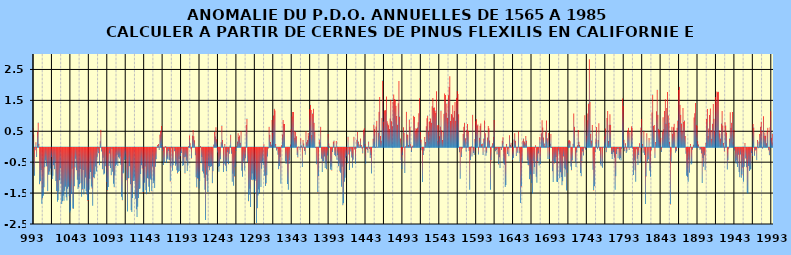
| Category | PDO |
|---|---|
| 993.0 | 0.611 |
| 994.0 | 0.399 |
| 995.0 | -0.904 |
| 996.0 | -0.085 |
| 997.0 | 0.143 |
| 998.0 | -0.303 |
| 999.0 | 0.488 |
| 1000.0 | 0.783 |
| 1001.0 | 0.096 |
| 1002.0 | -1.183 |
| 1003.0 | -1.089 |
| 1004.0 | -0.722 |
| 1005.0 | -1.811 |
| 1006.0 | -1.636 |
| 1007.0 | -1.558 |
| 1008.0 | -1.278 |
| 1009.0 | -0.634 |
| 1010.0 | -0.421 |
| 1011.0 | -0.595 |
| 1012.0 | -0.615 |
| 1013.0 | -1.404 |
| 1014.0 | -0.876 |
| 1015.0 | -0.767 |
| 1016.0 | -0.874 |
| 1017.0 | -0.673 |
| 1018.0 | -0.298 |
| 1019.0 | -1.015 |
| 1020.0 | -0.909 |
| 1021.0 | -0.565 |
| 1022.0 | -0.698 |
| 1023.0 | -0.473 |
| 1024.0 | -1.076 |
| 1025.0 | -1.407 |
| 1026.0 | -1.744 |
| 1027.0 | -1.692 |
| 1028.0 | -1.418 |
| 1029.0 | -1.055 |
| 1030.0 | -0.66 |
| 1031.0 | -1.165 |
| 1032.0 | -1.823 |
| 1033.0 | -1.731 |
| 1034.0 | -1.554 |
| 1035.0 | -1.716 |
| 1036.0 | -1.389 |
| 1037.0 | -1.262 |
| 1038.0 | -1.604 |
| 1039.0 | -1.711 |
| 1040.0 | -1.331 |
| 1041.0 | -1.259 |
| 1042.0 | -1.573 |
| 1043.0 | -2.099 |
| 1044.0 | -2.033 |
| 1045.0 | -1.489 |
| 1046.0 | -0.681 |
| 1047.0 | -1.965 |
| 1048.0 | -1.972 |
| 1049.0 | -1.246 |
| 1050.0 | -0.638 |
| 1051.0 | -0.354 |
| 1052.0 | -0.732 |
| 1053.0 | -1.035 |
| 1054.0 | -1.338 |
| 1055.0 | -1.276 |
| 1056.0 | -1.183 |
| 1057.0 | -0.689 |
| 1058.0 | -1.151 |
| 1059.0 | -1.589 |
| 1060.0 | -1.348 |
| 1061.0 | -0.721 |
| 1062.0 | -1.513 |
| 1063.0 | -1.329 |
| 1064.0 | -0.964 |
| 1065.0 | -1.408 |
| 1066.0 | -1.512 |
| 1067.0 | -1.706 |
| 1068.0 | -1.704 |
| 1069.0 | -1.356 |
| 1070.0 | -1.006 |
| 1071.0 | -0.784 |
| 1072.0 | -1.258 |
| 1073.0 | -1.318 |
| 1074.0 | -1.878 |
| 1075.0 | -0.954 |
| 1076.0 | -0.985 |
| 1077.0 | -0.86 |
| 1078.0 | -0.61 |
| 1079.0 | -0.769 |
| 1080.0 | -0.32 |
| 1081.0 | -0.068 |
| 1082.0 | -0.18 |
| 1083.0 | -0.569 |
| 1084.0 | 0.177 |
| 1085.0 | 0.547 |
| 1086.0 | -0.126 |
| 1087.0 | -0.696 |
| 1088.0 | -0.323 |
| 1089.0 | -0.868 |
| 1090.0 | -0.837 |
| 1091.0 | -0.6 |
| 1092.0 | -0.016 |
| 1093.0 | -1.122 |
| 1094.0 | -1.381 |
| 1095.0 | -1.273 |
| 1096.0 | -0.59 |
| 1097.0 | -0.183 |
| 1098.0 | -0.655 |
| 1099.0 | -0.892 |
| 1100.0 | -0.043 |
| 1101.0 | -0.778 |
| 1102.0 | -1.166 |
| 1103.0 | -1.277 |
| 1104.0 | -0.9 |
| 1105.0 | -0.595 |
| 1106.0 | -0.555 |
| 1107.0 | -0.229 |
| 1108.0 | -0.593 |
| 1109.0 | -0.304 |
| 1110.0 | -0.349 |
| 1111.0 | -0.281 |
| 1112.0 | -0.555 |
| 1113.0 | -1.584 |
| 1114.0 | -1.696 |
| 1115.0 | -0.834 |
| 1116.0 | -0.811 |
| 1117.0 | -0.4 |
| 1118.0 | -0.19 |
| 1119.0 | -0.38 |
| 1120.0 | -1.053 |
| 1121.0 | -2.064 |
| 1122.0 | -0.995 |
| 1123.0 | -0.979 |
| 1124.0 | -0.598 |
| 1125.0 | -1.184 |
| 1126.0 | -2.022 |
| 1127.0 | -2.076 |
| 1128.0 | -1.626 |
| 1129.0 | -1.079 |
| 1130.0 | -0.975 |
| 1131.0 | -1.083 |
| 1132.0 | -1.647 |
| 1133.0 | -1.99 |
| 1134.0 | -2.243 |
| 1135.0 | -1.906 |
| 1136.0 | -1.627 |
| 1137.0 | -1.333 |
| 1138.0 | -1.318 |
| 1139.0 | -0.848 |
| 1140.0 | -0.563 |
| 1141.0 | -0.671 |
| 1142.0 | -1.447 |
| 1143.0 | -1.439 |
| 1144.0 | -1.133 |
| 1145.0 | -0.604 |
| 1146.0 | -1.373 |
| 1147.0 | -1.509 |
| 1148.0 | -0.983 |
| 1149.0 | -1.003 |
| 1150.0 | -1.263 |
| 1151.0 | -1.421 |
| 1152.0 | -1.001 |
| 1153.0 | -1.048 |
| 1154.0 | -1.412 |
| 1155.0 | -0.611 |
| 1156.0 | -1.145 |
| 1157.0 | -1.066 |
| 1158.0 | -1.3 |
| 1159.0 | -0.616 |
| 1160.0 | -0.376 |
| 1161.0 | -0.009 |
| 1162.0 | 0.054 |
| 1163.0 | 0.089 |
| 1164.0 | -0.072 |
| 1165.0 | 0.394 |
| 1166.0 | 0.518 |
| 1167.0 | 0.671 |
| 1168.0 | 0.07 |
| 1169.0 | -0.115 |
| 1170.0 | -0.562 |
| 1171.0 | -0.473 |
| 1172.0 | 0.007 |
| 1173.0 | 0.024 |
| 1174.0 | -0.497 |
| 1175.0 | -0.355 |
| 1176.0 | -0.389 |
| 1177.0 | -0.107 |
| 1178.0 | -0.408 |
| 1179.0 | -1.092 |
| 1180.0 | -0.598 |
| 1181.0 | -0.016 |
| 1182.0 | -0.748 |
| 1183.0 | -0.568 |
| 1184.0 | -0.001 |
| 1185.0 | -0.112 |
| 1186.0 | -0.586 |
| 1187.0 | -0.535 |
| 1188.0 | -0.727 |
| 1189.0 | -0.833 |
| 1190.0 | -0.777 |
| 1191.0 | -0.361 |
| 1192.0 | -0.751 |
| 1193.0 | -0.274 |
| 1194.0 | -0.167 |
| 1195.0 | -0.021 |
| 1196.0 | -0.588 |
| 1197.0 | -0.556 |
| 1198.0 | -0.306 |
| 1199.0 | -0.83 |
| 1200.0 | -0.294 |
| 1201.0 | -0.418 |
| 1202.0 | -0.755 |
| 1203.0 | -0.579 |
| 1204.0 | 0.025 |
| 1205.0 | 0.364 |
| 1206.0 | 0.116 |
| 1207.0 | -0.049 |
| 1208.0 | -0.347 |
| 1209.0 | 0.362 |
| 1210.0 | 0.541 |
| 1211.0 | 0.34 |
| 1212.0 | 0.207 |
| 1213.0 | -0.242 |
| 1214.0 | -0.953 |
| 1215.0 | -1.283 |
| 1216.0 | -0.995 |
| 1217.0 | -0.999 |
| 1218.0 | -1.321 |
| 1219.0 | -1.076 |
| 1220.0 | 0.02 |
| 1221.0 | -0.503 |
| 1222.0 | -0.297 |
| 1223.0 | -0.769 |
| 1224.0 | -0.835 |
| 1225.0 | -0.971 |
| 1226.0 | -1.356 |
| 1227.0 | -2.342 |
| 1228.0 | -0.876 |
| 1229.0 | -1.08 |
| 1230.0 | -1.437 |
| 1231.0 | -0.601 |
| 1232.0 | -0.727 |
| 1233.0 | -0.607 |
| 1234.0 | -0.626 |
| 1235.0 | -0.593 |
| 1236.0 | -1.149 |
| 1237.0 | -0.76 |
| 1238.0 | 0.069 |
| 1239.0 | 0.483 |
| 1240.0 | 0.331 |
| 1241.0 | 0.627 |
| 1242.0 | 0.239 |
| 1243.0 | -0.158 |
| 1244.0 | -0.624 |
| 1245.0 | -0.779 |
| 1246.0 | -0.595 |
| 1247.0 | -0.376 |
| 1248.0 | 0.145 |
| 1249.0 | 0.686 |
| 1250.0 | 0.218 |
| 1251.0 | -0.786 |
| 1252.0 | -0.542 |
| 1253.0 | 0.088 |
| 1254.0 | -0.586 |
| 1255.0 | -0.751 |
| 1256.0 | -0.47 |
| 1257.0 | -0.148 |
| 1258.0 | -0.536 |
| 1259.0 | -0.197 |
| 1260.0 | 0.038 |
| 1261.0 | 0.394 |
| 1262.0 | -0.192 |
| 1263.0 | -1.1 |
| 1264.0 | -0.843 |
| 1265.0 | -1.227 |
| 1266.0 | -0.929 |
| 1267.0 | -0.629 |
| 1268.0 | -0.11 |
| 1269.0 | 0.019 |
| 1270.0 | 0.168 |
| 1271.0 | 0.433 |
| 1272.0 | 0.314 |
| 1273.0 | 0.365 |
| 1274.0 | 0.129 |
| 1275.0 | 0.498 |
| 1276.0 | -0.746 |
| 1277.0 | -0.935 |
| 1278.0 | -0.454 |
| 1279.0 | -0.407 |
| 1280.0 | -0.741 |
| 1281.0 | -0.341 |
| 1282.0 | 0.702 |
| 1283.0 | 0.913 |
| 1284.0 | -0.463 |
| 1285.0 | -1.732 |
| 1286.0 | -1.518 |
| 1287.0 | -1.326 |
| 1288.0 | -1.915 |
| 1289.0 | -1.036 |
| 1290.0 | -0.835 |
| 1291.0 | -1.054 |
| 1292.0 | -1.03 |
| 1293.0 | -1.466 |
| 1294.0 | -1.014 |
| 1295.0 | -1.07 |
| 1296.0 | -2.443 |
| 1297.0 | -1.961 |
| 1298.0 | -1.548 |
| 1299.0 | -1.355 |
| 1300.0 | -1.471 |
| 1301.0 | -0.496 |
| 1302.0 | -1.27 |
| 1303.0 | -0.684 |
| 1304.0 | -0.454 |
| 1305.0 | -0.565 |
| 1306.0 | 0.082 |
| 1307.0 | -0.904 |
| 1308.0 | -1.235 |
| 1309.0 | -1.154 |
| 1310.0 | -0.886 |
| 1311.0 | -0.286 |
| 1312.0 | -0.022 |
| 1313.0 | 0.649 |
| 1314.0 | 0.389 |
| 1315.0 | 0.154 |
| 1316.0 | 0.067 |
| 1317.0 | 0.862 |
| 1318.0 | 0.448 |
| 1319.0 | 1.014 |
| 1320.0 | 1.226 |
| 1321.0 | 1.173 |
| 1322.0 | 0.091 |
| 1323.0 | -0.093 |
| 1324.0 | -0.03 |
| 1325.0 | -0.225 |
| 1326.0 | -0.697 |
| 1327.0 | -0.593 |
| 1328.0 | -0.301 |
| 1329.0 | -1.164 |
| 1330.0 | 0.049 |
| 1331.0 | 0.399 |
| 1332.0 | 0.864 |
| 1333.0 | 0.738 |
| 1334.0 | 0.736 |
| 1335.0 | -0.431 |
| 1336.0 | -0.526 |
| 1337.0 | -0.453 |
| 1338.0 | -1.174 |
| 1339.0 | -1.361 |
| 1340.0 | -0.529 |
| 1341.0 | -0.411 |
| 1342.0 | 0.075 |
| 1343.0 | 0.584 |
| 1344.0 | 0.981 |
| 1345.0 | 1.125 |
| 1346.0 | 1.122 |
| 1347.0 | 0.514 |
| 1348.0 | 0.291 |
| 1349.0 | 0.482 |
| 1350.0 | 0.338 |
| 1351.0 | -0.234 |
| 1352.0 | -0.316 |
| 1353.0 | 0.011 |
| 1354.0 | -0.001 |
| 1355.0 | -0.07 |
| 1356.0 | 0.272 |
| 1357.0 | 0.038 |
| 1358.0 | -0.623 |
| 1359.0 | 0.216 |
| 1360.0 | 0.107 |
| 1361.0 | -0.109 |
| 1362.0 | -0.227 |
| 1363.0 | 0.499 |
| 1364.0 | 0.147 |
| 1365.0 | 0.216 |
| 1366.0 | 0.441 |
| 1367.0 | 0.343 |
| 1368.0 | 1.211 |
| 1369.0 | 1.36 |
| 1370.0 | 1.189 |
| 1371.0 | 0.381 |
| 1372.0 | 1.074 |
| 1373.0 | 1.232 |
| 1374.0 | 0.776 |
| 1375.0 | 0.486 |
| 1376.0 | -0.005 |
| 1377.0 | -0.531 |
| 1378.0 | -0.009 |
| 1379.0 | -1.447 |
| 1380.0 | -0.924 |
| 1381.0 | 0.232 |
| 1382.0 | 0.147 |
| 1383.0 | 0.644 |
| 1384.0 | -0.355 |
| 1385.0 | -0.787 |
| 1386.0 | -0.429 |
| 1387.0 | -0.45 |
| 1388.0 | -0.287 |
| 1389.0 | -0.653 |
| 1390.0 | -0.513 |
| 1391.0 | -0.695 |
| 1392.0 | -0.254 |
| 1393.0 | 0.423 |
| 1394.0 | 0.106 |
| 1395.0 | 0.012 |
| 1396.0 | -0.708 |
| 1397.0 | -0.619 |
| 1398.0 | -0.737 |
| 1399.0 | -0.139 |
| 1400.0 | 0.16 |
| 1401.0 | 0.199 |
| 1402.0 | -0.232 |
| 1403.0 | -0.277 |
| 1404.0 | 0.184 |
| 1405.0 | -0.392 |
| 1406.0 | -0.235 |
| 1407.0 | -0.601 |
| 1408.0 | -0.502 |
| 1409.0 | -0.767 |
| 1410.0 | -0.813 |
| 1411.0 | -1.259 |
| 1412.0 | -0.617 |
| 1413.0 | -1.858 |
| 1414.0 | -1.797 |
| 1415.0 | -1.105 |
| 1416.0 | -0.97 |
| 1417.0 | -0.326 |
| 1418.0 | -0.276 |
| 1419.0 | -0.507 |
| 1420.0 | 0.329 |
| 1421.0 | -0.218 |
| 1422.0 | -0.721 |
| 1423.0 | -0.125 |
| 1424.0 | -0.023 |
| 1425.0 | -0.318 |
| 1426.0 | -0.651 |
| 1427.0 | -0.386 |
| 1428.0 | 0.325 |
| 1429.0 | -0.056 |
| 1430.0 | -0.522 |
| 1431.0 | -0.03 |
| 1432.0 | 0.229 |
| 1433.0 | 0.484 |
| 1434.0 | 0.167 |
| 1435.0 | -0.011 |
| 1436.0 | 0.074 |
| 1437.0 | 0.268 |
| 1438.0 | 0.052 |
| 1439.0 | -0.032 |
| 1440.0 | -0.183 |
| 1441.0 | 0.551 |
| 1442.0 | 0.599 |
| 1443.0 | 0.097 |
| 1444.0 | -0.521 |
| 1445.0 | -0.043 |
| 1446.0 | -0.073 |
| 1447.0 | -0.163 |
| 1448.0 | 0.166 |
| 1449.0 | -0.04 |
| 1450.0 | -0.335 |
| 1451.0 | -0.238 |
| 1452.0 | -0.836 |
| 1453.0 | 0.007 |
| 1454.0 | 0.262 |
| 1455.0 | 0.719 |
| 1456.0 | 0.58 |
| 1457.0 | -0.012 |
| 1458.0 | 0.655 |
| 1459.0 | 0.843 |
| 1460.0 | -0.003 |
| 1461.0 | 0.457 |
| 1462.0 | 1.129 |
| 1463.0 | 1.605 |
| 1464.0 | 0.345 |
| 1465.0 | 0.19 |
| 1466.0 | 0.929 |
| 1467.0 | 2.14 |
| 1468.0 | 0.814 |
| 1469.0 | 1.153 |
| 1470.0 | 1.186 |
| 1471.0 | 1.181 |
| 1472.0 | 1.626 |
| 1473.0 | 0.827 |
| 1474.0 | 0.755 |
| 1475.0 | 0.693 |
| 1476.0 | 0.573 |
| 1477.0 | 0.914 |
| 1478.0 | 1.52 |
| 1479.0 | 0.825 |
| 1480.0 | 0.662 |
| 1481.0 | 1.45 |
| 1482.0 | 1.693 |
| 1483.0 | 1.546 |
| 1484.0 | 1.519 |
| 1485.0 | 1.328 |
| 1486.0 | 0.991 |
| 1487.0 | 0.711 |
| 1488.0 | 1.405 |
| 1489.0 | 2.124 |
| 1490.0 | 0.976 |
| 1491.0 | 0.267 |
| 1492.0 | -0.394 |
| 1493.0 | -0.688 |
| 1494.0 | -0.246 |
| 1495.0 | 0.628 |
| 1496.0 | 0.456 |
| 1497.0 | -0.815 |
| 1498.0 | 0.018 |
| 1499.0 | 1.131 |
| 1500.0 | 0.404 |
| 1501.0 | 0.381 |
| 1502.0 | 0.06 |
| 1503.0 | 0.88 |
| 1504.0 | 0.649 |
| 1505.0 | 0.081 |
| 1506.0 | -0.139 |
| 1507.0 | 0.025 |
| 1508.0 | 0.041 |
| 1509.0 | 1 |
| 1510.0 | 0.958 |
| 1511.0 | 0.511 |
| 1512.0 | 0.599 |
| 1513.0 | 0.585 |
| 1514.0 | 0.621 |
| 1515.0 | 0.79 |
| 1516.0 | 1.081 |
| 1517.0 | 1.571 |
| 1518.0 | 0.485 |
| 1519.0 | 0.231 |
| 1520.0 | -0.083 |
| 1521.0 | -1.113 |
| 1522.0 | -0.232 |
| 1523.0 | -0.101 |
| 1524.0 | 0.312 |
| 1525.0 | 0.155 |
| 1526.0 | 0.664 |
| 1527.0 | 0.923 |
| 1528.0 | 1.006 |
| 1529.0 | 0.483 |
| 1530.0 | 0.801 |
| 1531.0 | 0.83 |
| 1532.0 | 0.916 |
| 1533.0 | 0.775 |
| 1534.0 | 1.308 |
| 1535.0 | 1.575 |
| 1536.0 | 1.265 |
| 1537.0 | 1.272 |
| 1538.0 | 1.17 |
| 1539.0 | 1.094 |
| 1540.0 | 1.798 |
| 1541.0 | 0.699 |
| 1542.0 | 0.186 |
| 1543.0 | 0.706 |
| 1544.0 | 0.34 |
| 1545.0 | 0.653 |
| 1546.0 | 1.169 |
| 1547.0 | 0.53 |
| 1548.0 | 0.215 |
| 1549.0 | 0.492 |
| 1550.0 | 1.07 |
| 1551.0 | 1.724 |
| 1552.0 | 1.676 |
| 1553.0 | 1.102 |
| 1554.0 | 1.397 |
| 1555.0 | 0.934 |
| 1556.0 | 1.662 |
| 1557.0 | 1.931 |
| 1558.0 | 2.28 |
| 1559.0 | 0.835 |
| 1560.0 | 1.057 |
| 1561.0 | 1.022 |
| 1562.0 | 1.345 |
| 1563.0 | 0.949 |
| 1564.0 | 1.156 |
| 1565.0 | 1.444 |
| 1566.0 | 0.838 |
| 1567.0 | 1.581 |
| 1568.0 | 1.816 |
| 1569.0 | 1.708 |
| 1570.0 | 1.049 |
| 1571.0 | -0.148 |
| 1572.0 | -1.008 |
| 1573.0 | -0.007 |
| 1574.0 | -0.303 |
| 1575.0 | -0.023 |
| 1576.0 | 0.412 |
| 1577.0 | 0.647 |
| 1578.0 | 0.775 |
| 1579.0 | 0.276 |
| 1580.0 | -0.122 |
| 1581.0 | 0.549 |
| 1582.0 | 0.735 |
| 1583.0 | 0.515 |
| 1584.0 | -0.107 |
| 1585.0 | -1.361 |
| 1586.0 | -0.398 |
| 1587.0 | 0.017 |
| 1588.0 | -0.288 |
| 1589.0 | 1.031 |
| 1590.0 | -0.167 |
| 1591.0 | -0.238 |
| 1592.0 | 0.25 |
| 1593.0 | 0.826 |
| 1594.0 | 0.888 |
| 1595.0 | 0.685 |
| 1596.0 | 0.722 |
| 1597.0 | -0.222 |
| 1598.0 | 0.29 |
| 1599.0 | 0.682 |
| 1600.0 | 0.752 |
| 1601.0 | 0.083 |
| 1602.0 | 0.101 |
| 1603.0 | -0.235 |
| 1604.0 | 0.263 |
| 1605.0 | 0.85 |
| 1606.0 | 0.437 |
| 1607.0 | -0.259 |
| 1608.0 | -0.166 |
| 1609.0 | 0.302 |
| 1610.0 | 0.674 |
| 1611.0 | 0.599 |
| 1612.0 | 0.205 |
| 1613.0 | -1.363 |
| 1614.0 | -0.412 |
| 1615.0 | 0.032 |
| 1616.0 | 0.112 |
| 1617.0 | 0.323 |
| 1618.0 | 0.869 |
| 1619.0 | -0.014 |
| 1620.0 | -0.113 |
| 1621.0 | -0.074 |
| 1622.0 | -0.217 |
| 1623.0 | -0.03 |
| 1624.0 | -0.539 |
| 1625.0 | -0.31 |
| 1626.0 | -0.657 |
| 1627.0 | -0.009 |
| 1628.0 | -0.071 |
| 1629.0 | 0.196 |
| 1630.0 | 0.306 |
| 1631.0 | -0.501 |
| 1632.0 | -0.555 |
| 1633.0 | -1.275 |
| 1634.0 | -1.207 |
| 1635.0 | 0.092 |
| 1636.0 | -0.203 |
| 1637.0 | -0.024 |
| 1638.0 | -0.278 |
| 1639.0 | 0.375 |
| 1640.0 | 0.062 |
| 1641.0 | 0.13 |
| 1642.0 | 0.01 |
| 1643.0 | -0.402 |
| 1644.0 | -0.331 |
| 1645.0 | 0.231 |
| 1646.0 | 0.435 |
| 1647.0 | 0.192 |
| 1648.0 | -0.27 |
| 1649.0 | -0.006 |
| 1650.0 | -0.161 |
| 1651.0 | 0.496 |
| 1652.0 | -0.177 |
| 1653.0 | -0.454 |
| 1654.0 | -1.786 |
| 1655.0 | -1.252 |
| 1656.0 | -0.479 |
| 1657.0 | 0.195 |
| 1658.0 | 0.265 |
| 1659.0 | 0.171 |
| 1660.0 | 0.109 |
| 1661.0 | 0.345 |
| 1662.0 | 0.199 |
| 1663.0 | -0.403 |
| 1664.0 | -0.553 |
| 1665.0 | -0.573 |
| 1666.0 | -1.018 |
| 1667.0 | -0.854 |
| 1668.0 | -0.902 |
| 1669.0 | -1.14 |
| 1670.0 | -1.484 |
| 1671.0 | -0.435 |
| 1672.0 | -0.846 |
| 1673.0 | -0.625 |
| 1674.0 | 0.045 |
| 1675.0 | -0.942 |
| 1676.0 | -1.13 |
| 1677.0 | -0.445 |
| 1678.0 | -0.184 |
| 1679.0 | -0.577 |
| 1680.0 | 0.313 |
| 1681.0 | -0.537 |
| 1682.0 | 0.435 |
| 1683.0 | 0.86 |
| 1684.0 | 0.622 |
| 1685.0 | 0.302 |
| 1686.0 | 0.103 |
| 1687.0 | 0.025 |
| 1688.0 | 0.475 |
| 1689.0 | 0.85 |
| 1690.0 | 0.278 |
| 1691.0 | -0.362 |
| 1692.0 | 0.446 |
| 1693.0 | -0.376 |
| 1694.0 | 0.093 |
| 1695.0 | 0.411 |
| 1696.0 | -0.009 |
| 1697.0 | -0.762 |
| 1698.0 | -1.11 |
| 1699.0 | -0.443 |
| 1700.0 | -0.508 |
| 1701.0 | -0.459 |
| 1702.0 | -0.3 |
| 1703.0 | -1.099 |
| 1704.0 | -1.111 |
| 1705.0 | -0.093 |
| 1706.0 | -0.208 |
| 1707.0 | -0.991 |
| 1708.0 | -0.791 |
| 1709.0 | -0.947 |
| 1710.0 | -1.215 |
| 1711.0 | -1.085 |
| 1712.0 | -0.283 |
| 1713.0 | -0.666 |
| 1714.0 | -0.941 |
| 1715.0 | -0.707 |
| 1716.0 | -1.385 |
| 1717.0 | -0.807 |
| 1718.0 | -0.012 |
| 1719.0 | 0.205 |
| 1720.0 | 0.206 |
| 1721.0 | 0.18 |
| 1722.0 | -0.611 |
| 1723.0 | -0.732 |
| 1724.0 | -0.412 |
| 1725.0 | 0.097 |
| 1726.0 | 1.077 |
| 1727.0 | 0.65 |
| 1728.0 | -0.467 |
| 1729.0 | -0.622 |
| 1730.0 | -0.156 |
| 1731.0 | 0.05 |
| 1732.0 | 0.543 |
| 1733.0 | 0.159 |
| 1734.0 | 0.052 |
| 1735.0 | -0.821 |
| 1736.0 | -0.923 |
| 1737.0 | -0.443 |
| 1738.0 | -0.121 |
| 1739.0 | -0.254 |
| 1740.0 | -0.021 |
| 1741.0 | 1.019 |
| 1742.0 | -0.062 |
| 1743.0 | 0.355 |
| 1744.0 | 0.854 |
| 1745.0 | 1.078 |
| 1746.0 | 1.395 |
| 1747.0 | 2.832 |
| 1748.0 | 1.46 |
| 1749.0 | 0.424 |
| 1750.0 | 0.199 |
| 1751.0 | 0.7 |
| 1752.0 | -0.713 |
| 1753.0 | -1.382 |
| 1754.0 | -1.249 |
| 1755.0 | -0.143 |
| 1756.0 | 0.235 |
| 1757.0 | 0.642 |
| 1758.0 | -0.051 |
| 1759.0 | 0.217 |
| 1760.0 | 0.762 |
| 1761.0 | -0.099 |
| 1762.0 | -0.54 |
| 1763.0 | -0.601 |
| 1764.0 | -0.006 |
| 1765.0 | -0.648 |
| 1766.0 | -0.005 |
| 1767.0 | 0.004 |
| 1768.0 | 0.335 |
| 1769.0 | 0.591 |
| 1770.0 | -0.147 |
| 1771.0 | 0.927 |
| 1772.0 | 1.159 |
| 1773.0 | 0.186 |
| 1774.0 | 0.71 |
| 1775.0 | 1.054 |
| 1776.0 | 0.713 |
| 1777.0 | -0.2 |
| 1778.0 | -0.368 |
| 1779.0 | -0.203 |
| 1780.0 | -0.148 |
| 1781.0 | -0.32 |
| 1782.0 | -1.36 |
| 1783.0 | -0.926 |
| 1784.0 | -0.204 |
| 1785.0 | -0.042 |
| 1786.0 | -0.339 |
| 1787.0 | -0.04 |
| 1788.0 | -0.382 |
| 1789.0 | -0.329 |
| 1790.0 | -0.414 |
| 1791.0 | -0.044 |
| 1792.0 | 1.563 |
| 1793.0 | 1.325 |
| 1794.0 | 0.228 |
| 1795.0 | -0.117 |
| 1796.0 | 0.114 |
| 1797.0 | -0.171 |
| 1798.0 | -0.124 |
| 1799.0 | 0.527 |
| 1800.0 | 0.612 |
| 1801.0 | -0.073 |
| 1802.0 | 0.469 |
| 1803.0 | 0.007 |
| 1804.0 | 0.665 |
| 1805.0 | 0.605 |
| 1806.0 | -0.045 |
| 1807.0 | -0.882 |
| 1808.0 | -0.415 |
| 1809.0 | -0.726 |
| 1810.0 | -1.103 |
| 1811.0 | -0.052 |
| 1812.0 | -0.355 |
| 1813.0 | -0.557 |
| 1814.0 | -0.236 |
| 1815.0 | 0.116 |
| 1816.0 | -0.48 |
| 1817.0 | 0.622 |
| 1818.0 | 0.9 |
| 1819.0 | 0.09 |
| 1820.0 | -0.163 |
| 1821.0 | 0.523 |
| 1822.0 | -0.237 |
| 1823.0 | -1.818 |
| 1824.0 | -0.931 |
| 1825.0 | 0.437 |
| 1826.0 | -0.449 |
| 1827.0 | -0.379 |
| 1828.0 | 0.279 |
| 1829.0 | -0.741 |
| 1830.0 | -0.935 |
| 1831.0 | -0.087 |
| 1832.0 | 1.108 |
| 1833.0 | 1.689 |
| 1834.0 | 0.668 |
| 1835.0 | 0.703 |
| 1836.0 | -0.331 |
| 1837.0 | 0.155 |
| 1838.0 | 1.147 |
| 1839.0 | 1.844 |
| 1840.0 | 1.032 |
| 1841.0 | 0.583 |
| 1842.0 | 0.535 |
| 1843.0 | 0.208 |
| 1844.0 | 0.292 |
| 1845.0 | -0.139 |
| 1846.0 | 0.479 |
| 1847.0 | 0.952 |
| 1848.0 | 0.564 |
| 1849.0 | 1.152 |
| 1850.0 | 1.54 |
| 1851.0 | 0.748 |
| 1852.0 | 1.252 |
| 1853.0 | 1.774 |
| 1854.0 | 1.012 |
| 1855.0 | 0.769 |
| 1856.0 | 0.165 |
| 1857.0 | -1.835 |
| 1858.0 | -0.445 |
| 1859.0 | 0.643 |
| 1860.0 | 0.42 |
| 1861.0 | 0.632 |
| 1862.0 | 0.742 |
| 1863.0 | 0.472 |
| 1864.0 | -0.162 |
| 1865.0 | -0.114 |
| 1866.0 | 0.616 |
| 1867.0 | 0.848 |
| 1868.0 | 1.836 |
| 1869.0 | 1.94 |
| 1870.0 | 1.356 |
| 1871.0 | 1.033 |
| 1872.0 | 0.751 |
| 1873.0 | 0.508 |
| 1874.0 | 1.252 |
| 1875.0 | 0.798 |
| 1876.0 | 0.847 |
| 1877.0 | 0.345 |
| 1878.0 | -0.192 |
| 1879.0 | -0.903 |
| 1880.0 | -0.952 |
| 1881.0 | -1.098 |
| 1882.0 | -0.389 |
| 1883.0 | -0.812 |
| 1884.0 | 0.085 |
| 1885.0 | -0.543 |
| 1886.0 | -0.51 |
| 1887.0 | -0.067 |
| 1888.0 | 0.063 |
| 1889.0 | 0.948 |
| 1890.0 | 1.079 |
| 1891.0 | 1.416 |
| 1892.0 | 0.712 |
| 1893.0 | 0.673 |
| 1894.0 | 0.175 |
| 1895.0 | 0.073 |
| 1896.0 | 0 |
| 1897.0 | -0.068 |
| 1898.0 | -0.052 |
| 1899.0 | -0.184 |
| 1900.0 | -1.143 |
| 1901.0 | -0.331 |
| 1902.0 | -0.614 |
| 1903.0 | -0.243 |
| 1904.0 | -0.728 |
| 1905.0 | 0.125 |
| 1906.0 | 0.9 |
| 1907.0 | 1.217 |
| 1908.0 | 0.343 |
| 1909.0 | 0.593 |
| 1910.0 | 1.024 |
| 1911.0 | 1.24 |
| 1912.0 | 0.54 |
| 1913.0 | 0.261 |
| 1914.0 | 0.742 |
| 1915.0 | 1.384 |
| 1916.0 | 0.904 |
| 1917.0 | 0.501 |
| 1918.0 | 1.612 |
| 1919.0 | 1.462 |
| 1920.0 | 1.79 |
| 1921.0 | 1.76 |
| 1922.0 | 1.781 |
| 1923.0 | 0.535 |
| 1924.0 | 0.431 |
| 1925.0 | 0.265 |
| 1926.0 | 0.75 |
| 1927.0 | 1.158 |
| 1928.0 | 0.69 |
| 1929.0 | 0.121 |
| 1930.0 | -0.12 |
| 1931.0 | 0.795 |
| 1932.0 | 0.683 |
| 1933.0 | 0.461 |
| 1934.0 | -0.707 |
| 1935.0 | -0.404 |
| 1936.0 | -0.051 |
| 1937.0 | 0.266 |
| 1938.0 | 1.118 |
| 1939.0 | 0.617 |
| 1940.0 | 0.779 |
| 1941.0 | 1.126 |
| 1942.0 | 0.149 |
| 1943.0 | 0.545 |
| 1944.0 | -0.093 |
| 1945.0 | -0.457 |
| 1946.0 | -0.515 |
| 1947.0 | -0.409 |
| 1948.0 | -0.622 |
| 1949.0 | -0.229 |
| 1950.0 | -0.784 |
| 1951.0 | -0.953 |
| 1952.0 | -0.221 |
| 1953.0 | -0.969 |
| 1954.0 | -0.863 |
| 1955.0 | -0.638 |
| 1956.0 | -1.099 |
| 1957.0 | -0.614 |
| 1958.0 | 0.117 |
| 1959.0 | -0.347 |
| 1960.0 | -0.632 |
| 1961.0 | -1.46 |
| 1962.0 | -1.482 |
| 1963.0 | -0.591 |
| 1964.0 | -0.752 |
| 1965.0 | -0.711 |
| 1966.0 | -0.689 |
| 1967.0 | -0.174 |
| 1968.0 | -0.279 |
| 1969.0 | 0.737 |
| 1970.0 | 0.62 |
| 1971.0 | -0.256 |
| 1972.0 | -0.087 |
| 1973.0 | -0.065 |
| 1974.0 | -0.405 |
| 1975.0 | 0.219 |
| 1976.0 | -0.014 |
| 1977.0 | 0.169 |
| 1978.0 | 0.408 |
| 1979.0 | 0.644 |
| 1980.0 | 0.807 |
| 1981.0 | 0.523 |
| 1982.0 | -0.032 |
| 1983.0 | 0.983 |
| 1984.0 | 0.357 |
| 1985.0 | 0.464 |
| 1986.0 | 0.356 |
| 1987.0 | 0.113 |
| 1988.0 | 0.506 |
| 1989.0 | 0.617 |
| 1990.0 | -0.08 |
| 1991.0 | -0.244 |
| 1992.0 | 0.629 |
| 1993.0 | 1.15 |
| 1994.0 | 0.293 |
| 1995.0 | 0.427 |
| 1996.0 | 0.139 |